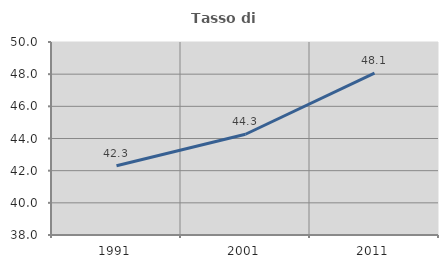
| Category | Tasso di occupazione   |
|---|---|
| 1991.0 | 42.308 |
| 2001.0 | 44.264 |
| 2011.0 | 48.069 |